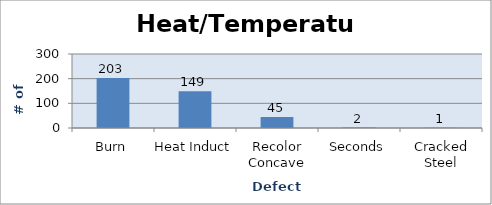
| Category | HEAT/TEMPERATURE |
|---|---|
| Burn | 203 |
| Heat Induct | 149 |
| Recolor Concave | 45 |
| Seconds | 2 |
| Cracked Steel | 1 |